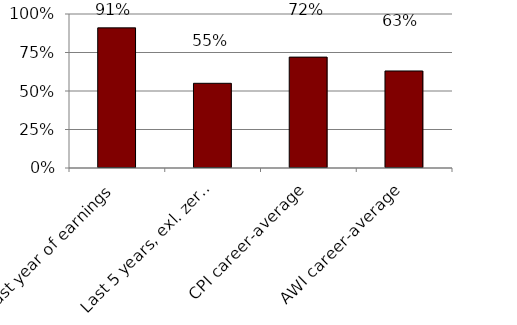
| Category | Replacement Rates |
|---|---|
| Last year of earnings | 0.91 |
| Last 5 years, exl. zeros | 0.55 |
| CPI career-average | 0.72 |
| AWI career-average | 0.63 |